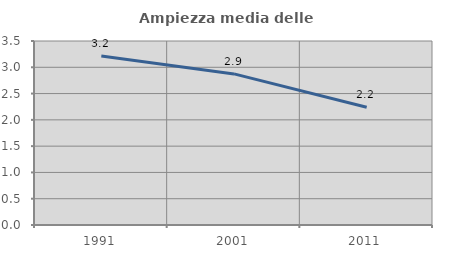
| Category | Ampiezza media delle famiglie |
|---|---|
| 1991.0 | 3.217 |
| 2001.0 | 2.874 |
| 2011.0 | 2.239 |